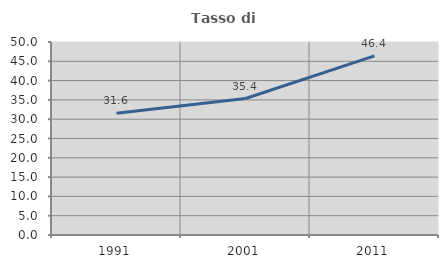
| Category | Tasso di occupazione   |
|---|---|
| 1991.0 | 31.566 |
| 2001.0 | 35.357 |
| 2011.0 | 46.413 |